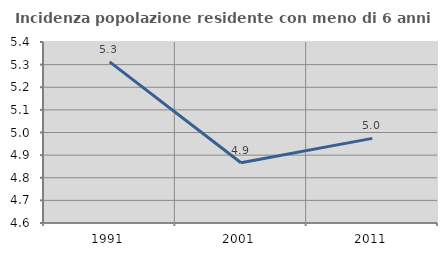
| Category | Incidenza popolazione residente con meno di 6 anni |
|---|---|
| 1991.0 | 5.312 |
| 2001.0 | 4.867 |
| 2011.0 | 4.974 |